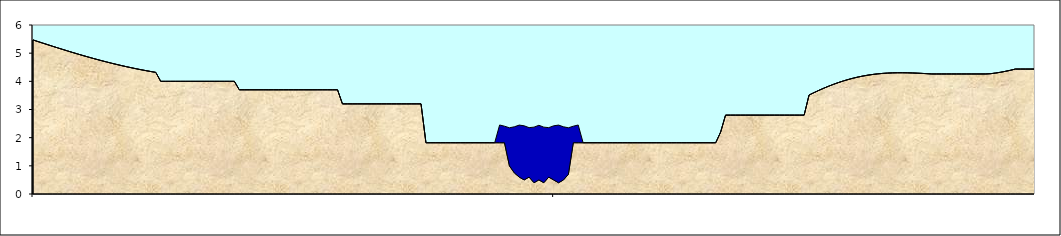
| Category | Series 0 | Series 1 |
|---|---|---|
| 0 | 5.469 | 0 |
| 1 | 5.413 | 0 |
| 2 | 5.356 | 0 |
| 3 | 5.3 | 0 |
| 4 | 5.244 | 0 |
| 5 | 5.189 | 0 |
| 6 | 5.135 | 0 |
| 7 | 5.081 | 0 |
| 8 | 5.028 | 0 |
| 9 | 4.976 | 0 |
| 10 | 4.925 | 0 |
| 11 | 4.875 | 0 |
| 12 | 4.826 | 0 |
| 13 | 4.778 | 0 |
| 14 | 4.732 | 0 |
| 15 | 4.687 | 0 |
| 16 | 4.643 | 0 |
| 17 | 4.601 | 0 |
| 18 | 4.56 | 0 |
| 19 | 4.521 | 0 |
| 20 | 4.483 | 0 |
| 21 | 4.447 | 0 |
| 22 | 4.412 | 0 |
| 23 | 4.379 | 0 |
| 24 | 4.348 | 0 |
| 25 | 4.318 | 0 |
| 26 | 4 | 0 |
| 27 | 4 | 0 |
| 28 | 4 | 0 |
| 29 | 4 | 0 |
| 30 | 4 | 0 |
| 31 | 4 | 0 |
| 32 | 4 | 0 |
| 33 | 4 | 0 |
| 34 | 4 | 0 |
| 35 | 4 | 0 |
| 36 | 4 | 0 |
| 37 | 4 | 0 |
| 38 | 4 | 0 |
| 39 | 4 | 0 |
| 40 | 4 | 0 |
| 41 | 4 | 0 |
| 42 | 3.7 | 0 |
| 43 | 3.7 | 0 |
| 44 | 3.7 | 0 |
| 45 | 3.7 | 0 |
| 46 | 3.7 | 0 |
| 47 | 3.7 | 0 |
| 48 | 3.7 | 0 |
| 49 | 3.7 | 0 |
| 50 | 3.7 | 0 |
| 51 | 3.7 | 0 |
| 52 | 3.7 | 0 |
| 53 | 3.7 | 0 |
| 54 | 3.7 | 0 |
| 55 | 3.7 | 0 |
| 56 | 3.7 | 0 |
| 57 | 3.7 | 0 |
| 58 | 3.7 | 0 |
| 59 | 3.7 | 0 |
| 60 | 3.7 | 0 |
| 61 | 3.7 | 0 |
| 62 | 3.7 | 0 |
| 63 | 3.2 | 0 |
| 64 | 3.2 | 0 |
| 65 | 3.2 | 0 |
| 66 | 3.2 | 0 |
| 67 | 3.2 | 0 |
| 68 | 3.2 | 0 |
| 69 | 3.2 | 0 |
| 70 | 3.2 | 0 |
| 71 | 3.2 | 0 |
| 72 | 3.2 | 0 |
| 73 | 3.2 | 0 |
| 74 | 3.2 | 0 |
| 75 | 3.2 | 0 |
| 76 | 3.2 | 0 |
| 77 | 3.2 | 0 |
| 78 | 3.2 | 0 |
| 79 | 3.2 | 0 |
| 80 | 1.82 | 0 |
| 81 | 1.82 | 0 |
| 82 | 1.82 | 0 |
| 83 | 1.82 | 0 |
| 84 | 1.82 | 0 |
| 85 | 1.82 | 0 |
| 86 | 1.82 | 0 |
| 87 | 1.82 | 0 |
| 88 | 1.82 | 0 |
| 89 | 1.82 | 0 |
| 90 | 1.82 | 0 |
| 91 | 1.82 | 0 |
| 92 | 1.82 | 0 |
| 93 | 1.82 | 0 |
| 94 | 1.82 | 0 |
| 95 | 1.82 | 0.63 |
| 96 | 1.82 | 0.587 |
| 97 | 1 | 1.351 |
| 98 | 0.75 | 1.636 |
| 99 | 0.6 | 1.847 |
| 100 | 0.5 | 1.921 |
| 101 | 0.6 | 1.756 |
| 102 | 0.4 | 1.973 |
| 103 | 0.5 | 1.94 |
| 104 | 0.4 | 1.973 |
| 105 | 0.6 | 1.756 |
| 106 | 0.5 | 1.921 |
| 107 | 0.4 | 2.047 |
| 108 | 0.5 | 1.886 |
| 109 | 0.7 | 1.651 |
| 110 | 1.82 | 0.587 |
| 111 | 1.82 | 0.63 |
| 112 | 1.82 | 0 |
| 113 | 1.82 | 0 |
| 114 | 1.82 | 0 |
| 115 | 1.82 | 0 |
| 116 | 1.82 | 0 |
| 117 | 1.82 | 0 |
| 118 | 1.82 | 0 |
| 119 | 1.82 | 0 |
| 120 | 1.82 | 0 |
| 121 | 1.82 | 0 |
| 122 | 1.82 | 0 |
| 123 | 1.82 | 0 |
| 124 | 1.82 | 0 |
| 125 | 1.82 | 0 |
| 126 | 1.82 | 0 |
| 127 | 1.82 | 0 |
| 128 | 1.82 | 0 |
| 129 | 1.82 | 0 |
| 130 | 1.82 | 0 |
| 131 | 1.82 | 0 |
| 132 | 1.82 | 0 |
| 133 | 1.82 | 0 |
| 134 | 1.82 | 0 |
| 135 | 1.82 | 0 |
| 136 | 1.82 | 0 |
| 137 | 1.82 | 0 |
| 138 | 1.82 | 0 |
| 139 | 1.82 | 0 |
| 140 | 2.2 | 0 |
| 141 | 2.8 | 0 |
| 142 | 2.8 | 0 |
| 143 | 2.8 | 0 |
| 144 | 2.8 | 0 |
| 145 | 2.8 | 0 |
| 146 | 2.8 | 0 |
| 147 | 2.8 | 0 |
| 148 | 2.8 | 0 |
| 149 | 2.8 | 0 |
| 150 | 2.8 | 0 |
| 151 | 2.8 | 0 |
| 152 | 2.8 | 0 |
| 153 | 2.8 | 0 |
| 154 | 2.8 | 0 |
| 155 | 2.8 | 0 |
| 156 | 2.8 | 0 |
| 157 | 2.8 | 0 |
| 158 | 3.513 | 0 |
| 159 | 3.598 | 0 |
| 160 | 3.679 | 0 |
| 161 | 3.756 | 0 |
| 162 | 3.828 | 0 |
| 163 | 3.895 | 0 |
| 164 | 3.957 | 0 |
| 165 | 4.014 | 0 |
| 166 | 4.066 | 0 |
| 167 | 4.112 | 0 |
| 168 | 4.153 | 0 |
| 169 | 4.189 | 0 |
| 170 | 4.22 | 0 |
| 171 | 4.245 | 0 |
| 172 | 4.266 | 0 |
| 173 | 4.282 | 0 |
| 174 | 4.293 | 0 |
| 175 | 4.3 | 0 |
| 176 | 4.304 | 0 |
| 177 | 4.305 | 0 |
| 178 | 4.302 | 0 |
| 179 | 4.297 | 0 |
| 180 | 4.29 | 0 |
| 181 | 4.282 | 0 |
| 182 | 4.272 | 0 |
| 183 | 4.262 | 0 |
| 184 | 4.262 | 0 |
| 185 | 4.262 | 0 |
| 186 | 4.262 | 0 |
| 187 | 4.262 | 0 |
| 188 | 4.262 | 0 |
| 189 | 4.262 | 0 |
| 190 | 4.262 | 0 |
| 191 | 4.262 | 0 |
| 192 | 4.262 | 0 |
| 193 | 4.262 | 0 |
| 194 | 4.262 | 0 |
| 195 | 4.272 | 0 |
| 196 | 4.295 | 0 |
| 197 | 4.323 | 0 |
| 198 | 4.356 | 0 |
| 199 | 4.393 | 0 |
| 200 | 4.436 | 0 |
| 201 | 4.436 | 0 |
| 202 | 4.436 | 0 |
| 203 | 4.436 | 0 |
| 204 | 4.436 | 0 |